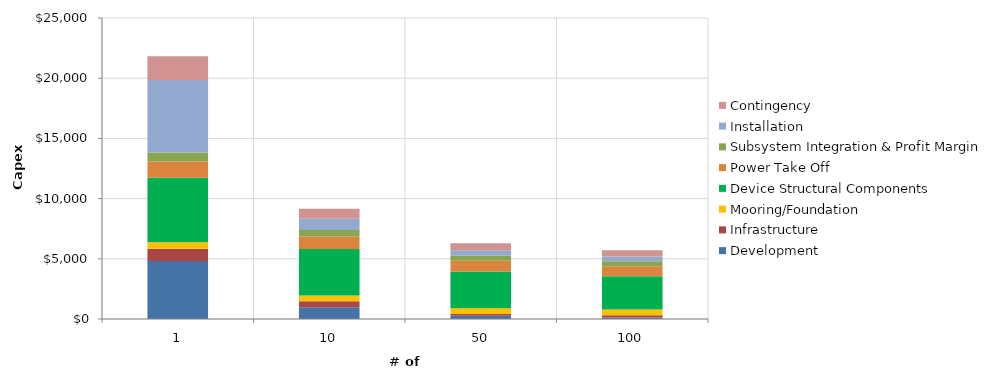
| Category | Development | Infrastructure | Mooring/Foundation | Device Structural Components | Power Take Off | Subsystem Integration & Profit Margin | Installation | Contingency |
|---|---|---|---|---|---|---|---|---|
| 1.0 | 4820 | 1010 | 540 | 5370 | 1350 | 730 | 6030 | 1980 |
| 10.0 | 970 | 500 | 480 | 3860 | 1050 | 540 | 930 | 830 |
| 50.0 | 260 | 150 | 480 | 3060 | 890 | 440 | 440 | 570 |
| 100.0 | 130 | 180 | 480 | 2770 | 830 | 410 | 390 | 520 |